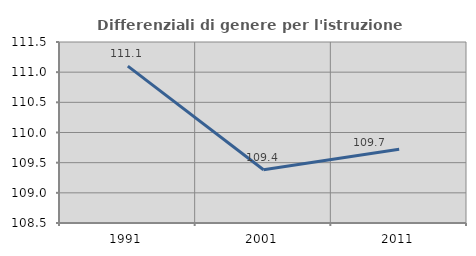
| Category | Differenziali di genere per l'istruzione superiore |
|---|---|
| 1991.0 | 111.101 |
| 2001.0 | 109.383 |
| 2011.0 | 109.723 |